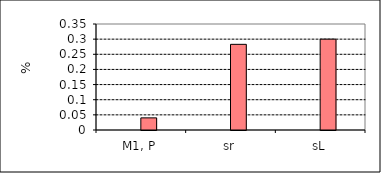
| Category | Series 1 | Series 0 | Series 5 | Series 6 |
|---|---|---|---|---|
| M1, P |  |  | 0.04 |  |
| sr |  |  | 0.283 |  |
| sL |  |  | 0.3 |  |